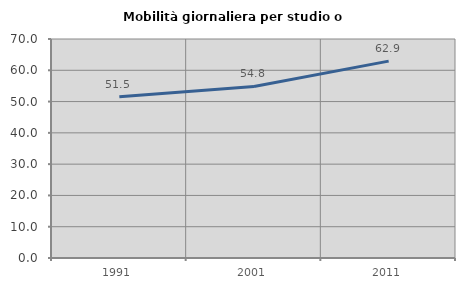
| Category | Mobilità giornaliera per studio o lavoro |
|---|---|
| 1991.0 | 51.543 |
| 2001.0 | 54.839 |
| 2011.0 | 62.935 |